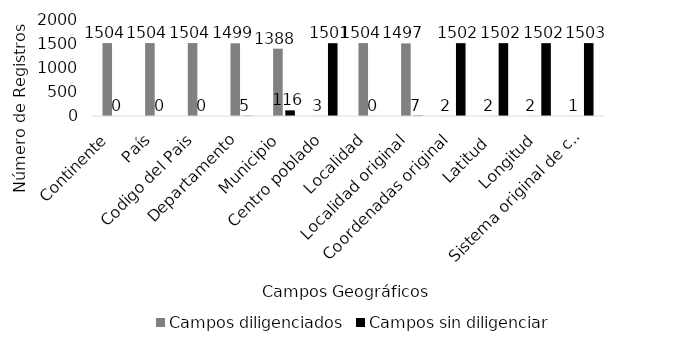
| Category | Campos diligenciados | Campos sin diligenciar |
|---|---|---|
| Continente | 1504 | 0 |
| País | 1504 | 0 |
| Codigo del Pais | 1504 | 0 |
| Departamento | 1499 | 5 |
| Municipio | 1388 | 116 |
| Centro poblado | 3 | 1501 |
| Localidad | 1504 | 0 |
| Localidad original | 1497 | 7 |
| Coordenadas original | 2 | 1502 |
| Latitud  | 2 | 1502 |
| Longitud | 2 | 1502 |
| Sistema original de coordenadas | 1 | 1503 |